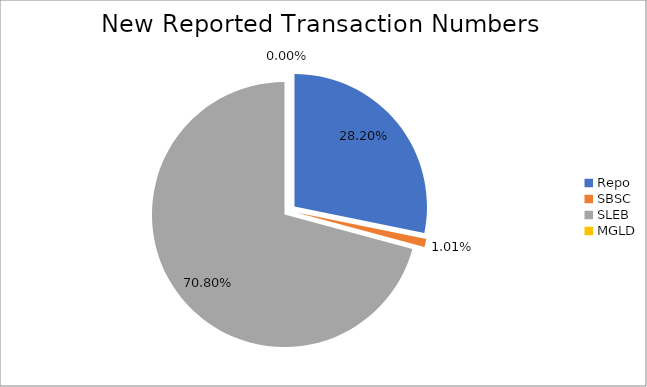
| Category | Series 0 |
|---|---|
| Repo | 243447 |
| SBSC | 8679 |
| SLEB | 611212 |
| MGLD | 10 |